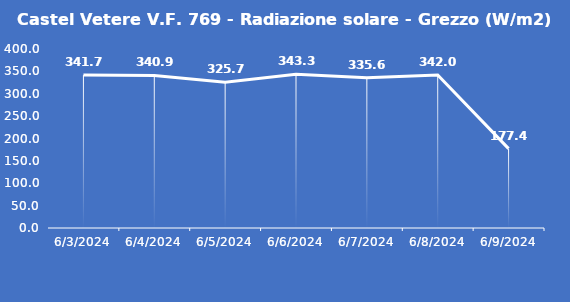
| Category | Castel Vetere V.F. 769 - Radiazione solare - Grezzo (W/m2) |
|---|---|
| 6/3/24 | 341.7 |
| 6/4/24 | 340.9 |
| 6/5/24 | 325.7 |
| 6/6/24 | 343.3 |
| 6/7/24 | 335.6 |
| 6/8/24 | 342 |
| 6/9/24 | 177.4 |